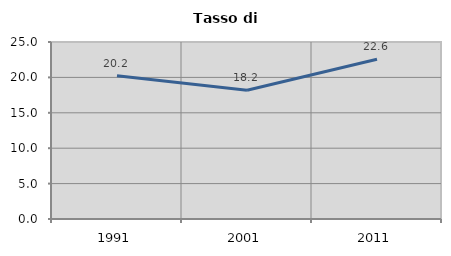
| Category | Tasso di disoccupazione   |
|---|---|
| 1991.0 | 20.246 |
| 2001.0 | 18.182 |
| 2011.0 | 22.564 |